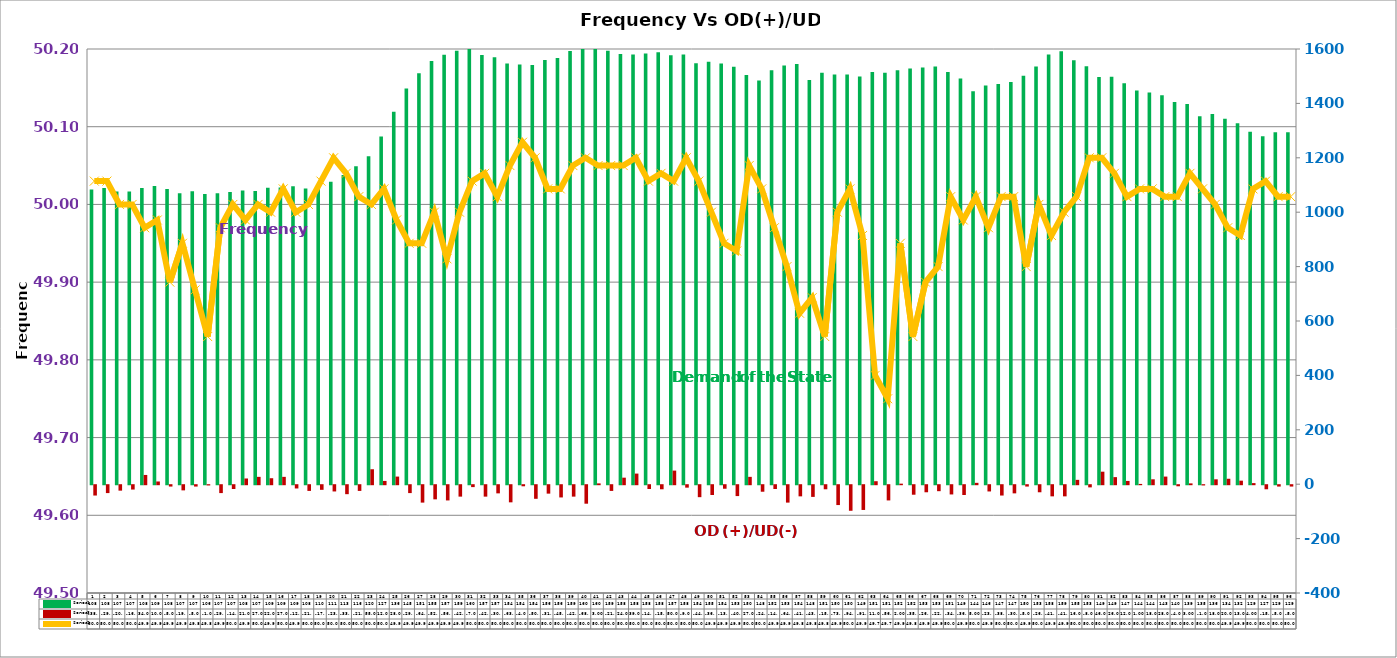
| Category | Series 2 | Series 4 |
|---|---|---|
| 0 | 1083 | -38 |
| 1 | 1089 | -29 |
| 2 | 1076 | -20 |
| 3 | 1076 | -16 |
| 4 | 1089 | 34 |
| 5 | 1096 | 10 |
| 6 | 1085 | -5 |
| 7 | 1070 | -19 |
| 8 | 1077 | -5 |
| 9 | 1067 | -1 |
| 10 | 1070 | -29 |
| 11 | 1074 | -14 |
| 12 | 1080 | 21 |
| 13 | 1078 | 27 |
| 14 | 1090 | 22 |
| 15 | 1091 | 27 |
| 16 | 1095 | -12 |
| 17 | 1087 | -21 |
| 18 | 1100 | -17 |
| 19 | 1112 | -23 |
| 20 | 1137 | -33 |
| 21 | 1169 | -21 |
| 22 | 1206 | 55 |
| 23 | 1278 | 12 |
| 24 | 1369 | 28 |
| 25 | 1455 | -29 |
| 26 | 1511 | -64 |
| 27 | 1556 | -52 |
| 28 | 1579 | -56 |
| 29 | 1594 | -42 |
| 30 | 1606 | -7 |
| 31 | 1578 | -42 |
| 32 | 1570 | -30 |
| 33 | 1547 | -63 |
| 34 | 1543 | -4 |
| 35 | 1541 | -50 |
| 36 | 1560 | -31 |
| 37 | 1567 | -45 |
| 38 | 1593 | -42 |
| 39 | 1603 | -68 |
| 40 | 1604 | 3 |
| 41 | 1594 | -21 |
| 42 | 1582 | 24 |
| 43 | 1580 | 39 |
| 44 | 1583 | -14 |
| 45 | 1588 | -15 |
| 46 | 1577 | 50 |
| 47 | 1580 | -9 |
| 48 | 1548 | -44 |
| 49 | 1553 | -36 |
| 50 | 1547 | -13 |
| 51 | 1535 | -40 |
| 52 | 1504 | 27 |
| 53 | 1484 | -24 |
| 54 | 1522 | -14 |
| 55 | 1539 | -64 |
| 56 | 1545 | -41 |
| 57 | 1486 | -43 |
| 58 | 1513 | -15 |
| 59 | 1506 | -73 |
| 60 | 1506 | -94 |
| 61 | 1499 | -91 |
| 62 | 1515 | 11 |
| 63 | 1513 | -56 |
| 64 | 1522 | 2 |
| 65 | 1528 | -35 |
| 66 | 1532 | -26 |
| 67 | 1536 | -22 |
| 68 | 1515 | -34 |
| 69 | 1492 | -36 |
| 70 | 1445 | 5 |
| 71 | 1466 | -23 |
| 72 | 1471 | -38 |
| 73 | 1479 | -30 |
| 74 | 1502 | -5 |
| 75 | 1536 | -26 |
| 76 | 1580 | -41 |
| 77 | 1591.333 | -41 |
| 78 | 1559 | 16 |
| 79 | 1537 | -8 |
| 80 | 1497 | 46 |
| 81 | 1498 | 26 |
| 82 | 1474 | 12 |
| 83 | 1447 | 1 |
| 84 | 1440 | 18 |
| 85 | 1430 | 28 |
| 86 | 1405 | -4 |
| 87 | 1398 | 3 |
| 88 | 1353 | -1 |
| 89 | 1361 | 18 |
| 90 | 1344 | 20 |
| 91 | 1327 | 13 |
| 92 | 1296 | 4 |
| 93 | 1279 | -15 |
| 94 | 1294 | -5 |
| 95 | 1294 | -5 |